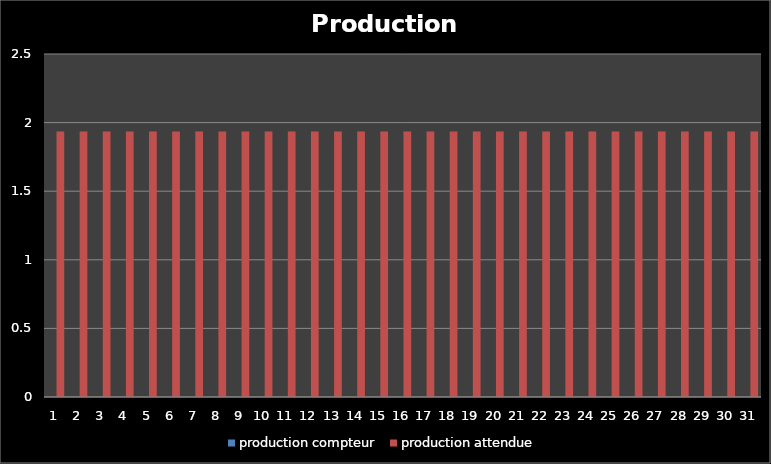
| Category | production compteur | production attendue |
|---|---|---|
| 1.0 | 0 | 1.935 |
| 2.0 | 0 | 1.935 |
| 3.0 | 0 | 1.935 |
| 4.0 | 0 | 1.935 |
| 5.0 | 0 | 1.935 |
| 6.0 | 0 | 1.935 |
| 7.0 | 0 | 1.935 |
| 8.0 | 0 | 1.935 |
| 9.0 | 0 | 1.935 |
| 10.0 | 0 | 1.935 |
| 11.0 | 0 | 1.935 |
| 12.0 | 0 | 1.935 |
| 13.0 | 0 | 1.935 |
| 14.0 | 0 | 1.935 |
| 15.0 | 0 | 1.935 |
| 16.0 | 0 | 1.935 |
| 17.0 | 0 | 1.935 |
| 18.0 | 0 | 1.935 |
| 19.0 | 0 | 1.935 |
| 20.0 | 0 | 1.935 |
| 21.0 | 0 | 1.935 |
| 22.0 | 0 | 1.935 |
| 23.0 | 0 | 1.935 |
| 24.0 | 0 | 1.935 |
| 25.0 | 0 | 1.935 |
| 26.0 | 0 | 1.935 |
| 27.0 | 0 | 1.935 |
| 28.0 | 0 | 1.935 |
| 29.0 | 0 | 1.935 |
| 30.0 | 0 | 1.935 |
| 31.0 | 0 | 1.935 |